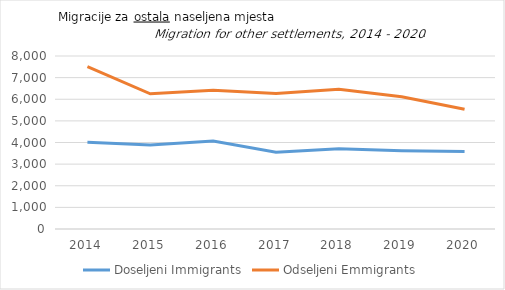
| Category | Doseljeni Immigrants | Odseljeni Emmigrants |
|---|---|---|
| 2014.0 | 4008 | 7507 |
| 2015.0 | 3886 | 6252 |
| 2016.0 | 4074 | 6413 |
| 2017.0 | 3547 | 6271 |
| 2018.0 | 3716 | 6460 |
| 2019.0 | 3623 | 6113 |
| 2020.0 | 3588 | 5539 |